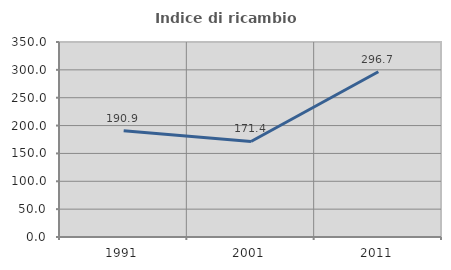
| Category | Indice di ricambio occupazionale  |
|---|---|
| 1991.0 | 190.909 |
| 2001.0 | 171.429 |
| 2011.0 | 296.667 |